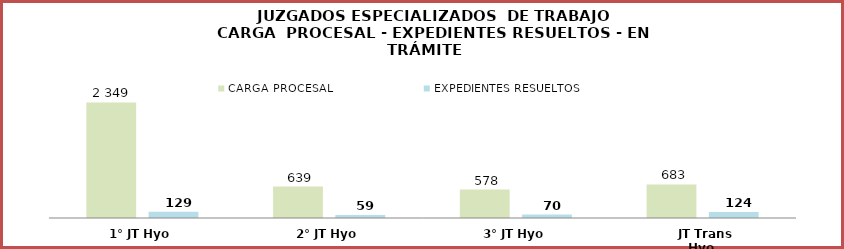
| Category | CARGA PROCESAL | EXPEDIENTES RESUELTOS |
|---|---|---|
| 1° JT Hyo | 2349 | 129 |
| 2° JT Hyo | 639 | 59 |
| 3° JT Hyo | 578 | 70 |
| JT Trans Hyo | 683 | 124 |